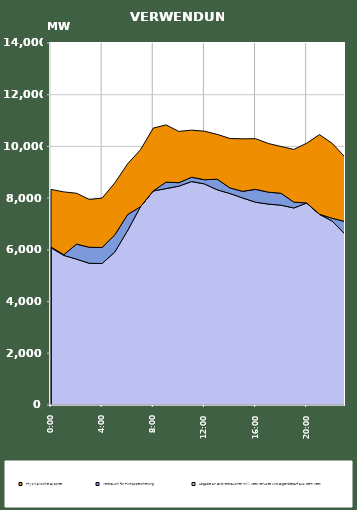
| Category | Abgabe an Endverbraucher inkl. Netzverluste und Eigenbedarf aus dem Netz | Verbrauch für Pumpspeicherung | Physikalische Exporte |
|---|---|---|---|
| 2007-01-17 | 6082.82 | 31.291 | 2222.685 |
| 2007-01-17 01:00:00 | 5785.845 | 25.193 | 2431.188 |
| 2007-01-17 02:00:00 | 5641.234 | 580.54 | 1967.757 |
| 2007-01-17 03:00:00 | 5479.694 | 619.87 | 1848.645 |
| 2007-01-17 04:00:00 | 5471.659 | 620.518 | 1909.15 |
| 2007-01-17 05:00:00 | 5922.616 | 662.483 | 2009.287 |
| 2007-01-17 06:00:00 | 6753.648 | 614.376 | 1964.335 |
| 2007-01-17 07:00:00 | 7667.48 | 0.292 | 2202.88 |
| 2007-01-17 08:00:00 | 8277.914 | 2.826 | 2427.674 |
| 2007-01-17 09:00:00 | 8368.996 | 250.432 | 2214.101 |
| 2007-01-17 10:00:00 | 8463.372 | 134.126 | 1983.785 |
| 2007-01-17 11:00:00 | 8641.462 | 167.544 | 1820.74 |
| 2007-01-17 12:00:00 | 8550.291 | 162.771 | 1876.506 |
| 2007-01-17 13:00:00 | 8322.891 | 409.855 | 1733.662 |
| 2007-01-17 14:00:00 | 8178.014 | 216.951 | 1912.516 |
| 2007-01-17 15:00:00 | 8006.083 | 258.031 | 2029.59 |
| 2007-01-17 16:00:00 | 7842.602 | 497.236 | 1960.118 |
| 2007-01-17 17:00:00 | 7769.872 | 461.482 | 1882.315 |
| 2007-01-17 18:00:00 | 7727.117 | 460.43 | 1810.062 |
| 2007-01-17 19:00:00 | 7619.257 | 226.125 | 2039.015 |
| 2007-01-17 20:00:00 | 7810.407 | 3.023 | 2309.574 |
| 2007-01-17 21:00:00 | 7375.472 | 3.458 | 3077.952 |
| 2007-01-17 22:00:00 | 7109.685 | 109.845 | 2900.803 |
| 2007-01-17 23:00:00 | 6607.493 | 488.9 | 2488.098 |